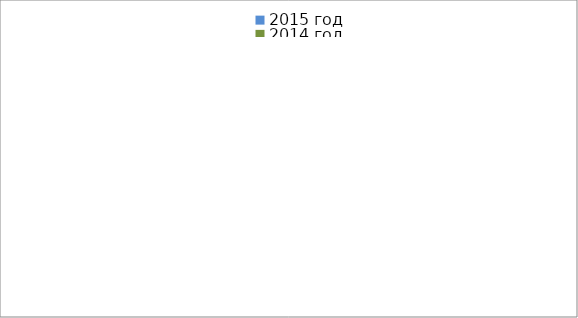
| Category | 2015 год | 2014 год |
|---|---|---|
|  - поджог | 34 | 23 |
|  - неосторожное обращение с огнём | 61 | 40 |
|  - НПТЭ электрооборудования | 8 | 18 |
|  - НПУ и Э печей | 68 | 62 |
|  - НПУ и Э транспортных средств | 45 | 54 |
|   -Шалость с огнем детей | 3 | 0 |
|  -НППБ при эксплуатации эл.приборов | 12 | 19 |
|  - курение | 21 | 20 |
| - прочие | 75 | 85 |
| - не установленные причины | 10 | 8 |